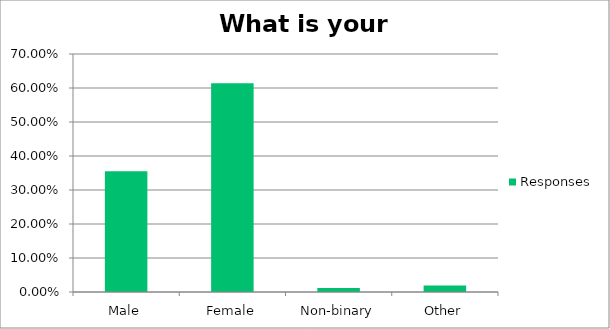
| Category | Responses |
|---|---|
| Male | 0.355 |
| Female | 0.614 |
| Non-binary | 0.012 |
| Other | 0.019 |